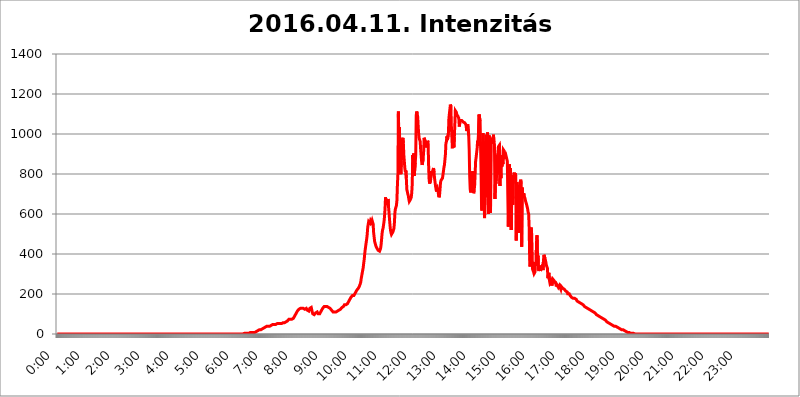
| Category | 2016.04.11. Intenzitás [W/m^2] |
|---|---|
| 0.0 | 0 |
| 0.0006944444444444445 | 0 |
| 0.001388888888888889 | 0 |
| 0.0020833333333333333 | 0 |
| 0.002777777777777778 | 0 |
| 0.003472222222222222 | 0 |
| 0.004166666666666667 | 0 |
| 0.004861111111111111 | 0 |
| 0.005555555555555556 | 0 |
| 0.0062499999999999995 | 0 |
| 0.006944444444444444 | 0 |
| 0.007638888888888889 | 0 |
| 0.008333333333333333 | 0 |
| 0.009027777777777779 | 0 |
| 0.009722222222222222 | 0 |
| 0.010416666666666666 | 0 |
| 0.011111111111111112 | 0 |
| 0.011805555555555555 | 0 |
| 0.012499999999999999 | 0 |
| 0.013194444444444444 | 0 |
| 0.013888888888888888 | 0 |
| 0.014583333333333332 | 0 |
| 0.015277777777777777 | 0 |
| 0.015972222222222224 | 0 |
| 0.016666666666666666 | 0 |
| 0.017361111111111112 | 0 |
| 0.018055555555555557 | 0 |
| 0.01875 | 0 |
| 0.019444444444444445 | 0 |
| 0.02013888888888889 | 0 |
| 0.020833333333333332 | 0 |
| 0.02152777777777778 | 0 |
| 0.022222222222222223 | 0 |
| 0.02291666666666667 | 0 |
| 0.02361111111111111 | 0 |
| 0.024305555555555556 | 0 |
| 0.024999999999999998 | 0 |
| 0.025694444444444447 | 0 |
| 0.02638888888888889 | 0 |
| 0.027083333333333334 | 0 |
| 0.027777777777777776 | 0 |
| 0.02847222222222222 | 0 |
| 0.029166666666666664 | 0 |
| 0.029861111111111113 | 0 |
| 0.030555555555555555 | 0 |
| 0.03125 | 0 |
| 0.03194444444444445 | 0 |
| 0.03263888888888889 | 0 |
| 0.03333333333333333 | 0 |
| 0.034027777777777775 | 0 |
| 0.034722222222222224 | 0 |
| 0.035416666666666666 | 0 |
| 0.036111111111111115 | 0 |
| 0.03680555555555556 | 0 |
| 0.0375 | 0 |
| 0.03819444444444444 | 0 |
| 0.03888888888888889 | 0 |
| 0.03958333333333333 | 0 |
| 0.04027777777777778 | 0 |
| 0.04097222222222222 | 0 |
| 0.041666666666666664 | 0 |
| 0.042361111111111106 | 0 |
| 0.04305555555555556 | 0 |
| 0.043750000000000004 | 0 |
| 0.044444444444444446 | 0 |
| 0.04513888888888889 | 0 |
| 0.04583333333333334 | 0 |
| 0.04652777777777778 | 0 |
| 0.04722222222222222 | 0 |
| 0.04791666666666666 | 0 |
| 0.04861111111111111 | 0 |
| 0.049305555555555554 | 0 |
| 0.049999999999999996 | 0 |
| 0.05069444444444445 | 0 |
| 0.051388888888888894 | 0 |
| 0.052083333333333336 | 0 |
| 0.05277777777777778 | 0 |
| 0.05347222222222222 | 0 |
| 0.05416666666666667 | 0 |
| 0.05486111111111111 | 0 |
| 0.05555555555555555 | 0 |
| 0.05625 | 0 |
| 0.05694444444444444 | 0 |
| 0.057638888888888885 | 0 |
| 0.05833333333333333 | 0 |
| 0.05902777777777778 | 0 |
| 0.059722222222222225 | 0 |
| 0.06041666666666667 | 0 |
| 0.061111111111111116 | 0 |
| 0.06180555555555556 | 0 |
| 0.0625 | 0 |
| 0.06319444444444444 | 0 |
| 0.06388888888888888 | 0 |
| 0.06458333333333334 | 0 |
| 0.06527777777777778 | 0 |
| 0.06597222222222222 | 0 |
| 0.06666666666666667 | 0 |
| 0.06736111111111111 | 0 |
| 0.06805555555555555 | 0 |
| 0.06874999999999999 | 0 |
| 0.06944444444444443 | 0 |
| 0.07013888888888889 | 0 |
| 0.07083333333333333 | 0 |
| 0.07152777777777779 | 0 |
| 0.07222222222222223 | 0 |
| 0.07291666666666667 | 0 |
| 0.07361111111111111 | 0 |
| 0.07430555555555556 | 0 |
| 0.075 | 0 |
| 0.07569444444444444 | 0 |
| 0.0763888888888889 | 0 |
| 0.07708333333333334 | 0 |
| 0.07777777777777778 | 0 |
| 0.07847222222222222 | 0 |
| 0.07916666666666666 | 0 |
| 0.0798611111111111 | 0 |
| 0.08055555555555556 | 0 |
| 0.08125 | 0 |
| 0.08194444444444444 | 0 |
| 0.08263888888888889 | 0 |
| 0.08333333333333333 | 0 |
| 0.08402777777777777 | 0 |
| 0.08472222222222221 | 0 |
| 0.08541666666666665 | 0 |
| 0.08611111111111112 | 0 |
| 0.08680555555555557 | 0 |
| 0.08750000000000001 | 0 |
| 0.08819444444444445 | 0 |
| 0.08888888888888889 | 0 |
| 0.08958333333333333 | 0 |
| 0.09027777777777778 | 0 |
| 0.09097222222222222 | 0 |
| 0.09166666666666667 | 0 |
| 0.09236111111111112 | 0 |
| 0.09305555555555556 | 0 |
| 0.09375 | 0 |
| 0.09444444444444444 | 0 |
| 0.09513888888888888 | 0 |
| 0.09583333333333333 | 0 |
| 0.09652777777777777 | 0 |
| 0.09722222222222222 | 0 |
| 0.09791666666666667 | 0 |
| 0.09861111111111111 | 0 |
| 0.09930555555555555 | 0 |
| 0.09999999999999999 | 0 |
| 0.10069444444444443 | 0 |
| 0.1013888888888889 | 0 |
| 0.10208333333333335 | 0 |
| 0.10277777777777779 | 0 |
| 0.10347222222222223 | 0 |
| 0.10416666666666667 | 0 |
| 0.10486111111111111 | 0 |
| 0.10555555555555556 | 0 |
| 0.10625 | 0 |
| 0.10694444444444444 | 0 |
| 0.1076388888888889 | 0 |
| 0.10833333333333334 | 0 |
| 0.10902777777777778 | 0 |
| 0.10972222222222222 | 0 |
| 0.1111111111111111 | 0 |
| 0.11180555555555556 | 0 |
| 0.11180555555555556 | 0 |
| 0.1125 | 0 |
| 0.11319444444444444 | 0 |
| 0.11388888888888889 | 0 |
| 0.11458333333333333 | 0 |
| 0.11527777777777777 | 0 |
| 0.11597222222222221 | 0 |
| 0.11666666666666665 | 0 |
| 0.1173611111111111 | 0 |
| 0.11805555555555557 | 0 |
| 0.11944444444444445 | 0 |
| 0.12013888888888889 | 0 |
| 0.12083333333333333 | 0 |
| 0.12152777777777778 | 0 |
| 0.12222222222222223 | 0 |
| 0.12291666666666667 | 0 |
| 0.12291666666666667 | 0 |
| 0.12361111111111112 | 0 |
| 0.12430555555555556 | 0 |
| 0.125 | 0 |
| 0.12569444444444444 | 0 |
| 0.12638888888888888 | 0 |
| 0.12708333333333333 | 0 |
| 0.16875 | 0 |
| 0.12847222222222224 | 0 |
| 0.12916666666666668 | 0 |
| 0.12986111111111112 | 0 |
| 0.13055555555555556 | 0 |
| 0.13125 | 0 |
| 0.13194444444444445 | 0 |
| 0.1326388888888889 | 0 |
| 0.13333333333333333 | 0 |
| 0.13402777777777777 | 0 |
| 0.13402777777777777 | 0 |
| 0.13472222222222222 | 0 |
| 0.13541666666666666 | 0 |
| 0.1361111111111111 | 0 |
| 0.13749999999999998 | 0 |
| 0.13819444444444443 | 0 |
| 0.1388888888888889 | 0 |
| 0.13958333333333334 | 0 |
| 0.14027777777777778 | 0 |
| 0.14097222222222222 | 0 |
| 0.14166666666666666 | 0 |
| 0.1423611111111111 | 0 |
| 0.14305555555555557 | 0 |
| 0.14375000000000002 | 0 |
| 0.14444444444444446 | 0 |
| 0.1451388888888889 | 0 |
| 0.1451388888888889 | 0 |
| 0.14652777777777778 | 0 |
| 0.14722222222222223 | 0 |
| 0.14791666666666667 | 0 |
| 0.1486111111111111 | 0 |
| 0.14930555555555555 | 0 |
| 0.15 | 0 |
| 0.15069444444444444 | 0 |
| 0.15138888888888888 | 0 |
| 0.15208333333333332 | 0 |
| 0.15277777777777776 | 0 |
| 0.15347222222222223 | 0 |
| 0.15416666666666667 | 0 |
| 0.15486111111111112 | 0 |
| 0.15555555555555556 | 0 |
| 0.15625 | 0 |
| 0.15694444444444444 | 0 |
| 0.15763888888888888 | 0 |
| 0.15833333333333333 | 0 |
| 0.15902777777777777 | 0 |
| 0.15972222222222224 | 0 |
| 0.16041666666666668 | 0 |
| 0.16111111111111112 | 0 |
| 0.16180555555555556 | 0 |
| 0.1625 | 0 |
| 0.16319444444444445 | 0 |
| 0.1638888888888889 | 0 |
| 0.16458333333333333 | 0 |
| 0.16527777777777777 | 0 |
| 0.16597222222222222 | 0 |
| 0.16666666666666666 | 0 |
| 0.1673611111111111 | 0 |
| 0.16805555555555554 | 0 |
| 0.16874999999999998 | 0 |
| 0.16944444444444443 | 0 |
| 0.17013888888888887 | 0 |
| 0.1708333333333333 | 0 |
| 0.17152777777777775 | 0 |
| 0.17222222222222225 | 0 |
| 0.1729166666666667 | 0 |
| 0.17361111111111113 | 0 |
| 0.17430555555555557 | 0 |
| 0.17500000000000002 | 0 |
| 0.17569444444444446 | 0 |
| 0.1763888888888889 | 0 |
| 0.17708333333333334 | 0 |
| 0.17777777777777778 | 0 |
| 0.17847222222222223 | 0 |
| 0.17916666666666667 | 0 |
| 0.1798611111111111 | 0 |
| 0.18055555555555555 | 0 |
| 0.18125 | 0 |
| 0.18194444444444444 | 0 |
| 0.1826388888888889 | 0 |
| 0.18333333333333335 | 0 |
| 0.1840277777777778 | 0 |
| 0.18472222222222223 | 0 |
| 0.18541666666666667 | 0 |
| 0.18611111111111112 | 0 |
| 0.18680555555555556 | 0 |
| 0.1875 | 0 |
| 0.18819444444444444 | 0 |
| 0.18888888888888888 | 0 |
| 0.18958333333333333 | 0 |
| 0.19027777777777777 | 0 |
| 0.1909722222222222 | 0 |
| 0.19166666666666665 | 0 |
| 0.19236111111111112 | 0 |
| 0.19305555555555554 | 0 |
| 0.19375 | 0 |
| 0.19444444444444445 | 0 |
| 0.1951388888888889 | 0 |
| 0.19583333333333333 | 0 |
| 0.19652777777777777 | 0 |
| 0.19722222222222222 | 0 |
| 0.19791666666666666 | 0 |
| 0.1986111111111111 | 0 |
| 0.19930555555555554 | 0 |
| 0.19999999999999998 | 0 |
| 0.20069444444444443 | 0 |
| 0.20138888888888887 | 0 |
| 0.2020833333333333 | 0 |
| 0.2027777777777778 | 0 |
| 0.2034722222222222 | 0 |
| 0.2041666666666667 | 0 |
| 0.20486111111111113 | 0 |
| 0.20555555555555557 | 0 |
| 0.20625000000000002 | 0 |
| 0.20694444444444446 | 0 |
| 0.2076388888888889 | 0 |
| 0.20833333333333334 | 0 |
| 0.20902777777777778 | 0 |
| 0.20972222222222223 | 0 |
| 0.21041666666666667 | 0 |
| 0.2111111111111111 | 0 |
| 0.21180555555555555 | 0 |
| 0.2125 | 0 |
| 0.21319444444444444 | 0 |
| 0.2138888888888889 | 0 |
| 0.21458333333333335 | 0 |
| 0.2152777777777778 | 0 |
| 0.21597222222222223 | 0 |
| 0.21666666666666667 | 0 |
| 0.21736111111111112 | 0 |
| 0.21805555555555556 | 0 |
| 0.21875 | 0 |
| 0.21944444444444444 | 0 |
| 0.22013888888888888 | 0 |
| 0.22083333333333333 | 0 |
| 0.22152777777777777 | 0 |
| 0.2222222222222222 | 0 |
| 0.22291666666666665 | 0 |
| 0.2236111111111111 | 0 |
| 0.22430555555555556 | 0 |
| 0.225 | 0 |
| 0.22569444444444445 | 0 |
| 0.2263888888888889 | 0 |
| 0.22708333333333333 | 0 |
| 0.22777777777777777 | 0 |
| 0.22847222222222222 | 0 |
| 0.22916666666666666 | 0 |
| 0.2298611111111111 | 0 |
| 0.23055555555555554 | 0 |
| 0.23124999999999998 | 0 |
| 0.23194444444444443 | 0 |
| 0.23263888888888887 | 0 |
| 0.2333333333333333 | 0 |
| 0.2340277777777778 | 0 |
| 0.2347222222222222 | 0 |
| 0.2354166666666667 | 0 |
| 0.23611111111111113 | 0 |
| 0.23680555555555557 | 0 |
| 0.23750000000000002 | 0 |
| 0.23819444444444446 | 0 |
| 0.2388888888888889 | 0 |
| 0.23958333333333334 | 0 |
| 0.24027777777777778 | 0 |
| 0.24097222222222223 | 0 |
| 0.24166666666666667 | 0 |
| 0.2423611111111111 | 0 |
| 0.24305555555555555 | 0 |
| 0.24375 | 0 |
| 0.24444444444444446 | 0 |
| 0.24513888888888888 | 0 |
| 0.24583333333333335 | 0 |
| 0.2465277777777778 | 0 |
| 0.24722222222222223 | 0 |
| 0.24791666666666667 | 0 |
| 0.24861111111111112 | 0 |
| 0.24930555555555556 | 0 |
| 0.25 | 0 |
| 0.25069444444444444 | 0 |
| 0.2513888888888889 | 0 |
| 0.2520833333333333 | 0 |
| 0.25277777777777777 | 0 |
| 0.2534722222222222 | 0 |
| 0.25416666666666665 | 0 |
| 0.2548611111111111 | 0 |
| 0.2555555555555556 | 0 |
| 0.25625000000000003 | 0 |
| 0.2569444444444445 | 0 |
| 0.2576388888888889 | 0 |
| 0.25833333333333336 | 0 |
| 0.2590277777777778 | 0 |
| 0.25972222222222224 | 0 |
| 0.2604166666666667 | 0 |
| 0.2611111111111111 | 3.525 |
| 0.26180555555555557 | 3.525 |
| 0.2625 | 3.525 |
| 0.26319444444444445 | 3.525 |
| 0.2638888888888889 | 3.525 |
| 0.26458333333333334 | 3.525 |
| 0.2652777777777778 | 3.525 |
| 0.2659722222222222 | 3.525 |
| 0.26666666666666666 | 3.525 |
| 0.2673611111111111 | 3.525 |
| 0.26805555555555555 | 3.525 |
| 0.26875 | 3.525 |
| 0.26944444444444443 | 7.887 |
| 0.2701388888888889 | 7.887 |
| 0.2708333333333333 | 7.887 |
| 0.27152777777777776 | 7.887 |
| 0.2722222222222222 | 7.887 |
| 0.27291666666666664 | 7.887 |
| 0.2736111111111111 | 7.887 |
| 0.2743055555555555 | 7.887 |
| 0.27499999999999997 | 7.887 |
| 0.27569444444444446 | 7.887 |
| 0.27638888888888885 | 7.887 |
| 0.27708333333333335 | 7.887 |
| 0.2777777777777778 | 7.887 |
| 0.27847222222222223 | 12.257 |
| 0.2791666666666667 | 12.257 |
| 0.2798611111111111 | 12.257 |
| 0.28055555555555556 | 12.257 |
| 0.28125 | 16.636 |
| 0.28194444444444444 | 16.636 |
| 0.2826388888888889 | 16.636 |
| 0.2833333333333333 | 21.024 |
| 0.28402777777777777 | 21.024 |
| 0.2847222222222222 | 21.024 |
| 0.28541666666666665 | 21.024 |
| 0.28611111111111115 | 21.024 |
| 0.28680555555555554 | 21.024 |
| 0.28750000000000003 | 25.419 |
| 0.2881944444444445 | 25.419 |
| 0.2888888888888889 | 25.419 |
| 0.28958333333333336 | 29.823 |
| 0.2902777777777778 | 29.823 |
| 0.29097222222222224 | 29.823 |
| 0.2916666666666667 | 34.234 |
| 0.2923611111111111 | 34.234 |
| 0.29305555555555557 | 34.234 |
| 0.29375 | 38.653 |
| 0.29444444444444445 | 38.653 |
| 0.2951388888888889 | 38.653 |
| 0.29583333333333334 | 38.653 |
| 0.2965277777777778 | 38.653 |
| 0.2972222222222222 | 38.653 |
| 0.29791666666666666 | 38.653 |
| 0.2986111111111111 | 38.653 |
| 0.29930555555555555 | 38.653 |
| 0.3 | 43.079 |
| 0.30069444444444443 | 43.079 |
| 0.3013888888888889 | 43.079 |
| 0.3020833333333333 | 47.511 |
| 0.30277777777777776 | 47.511 |
| 0.3034722222222222 | 47.511 |
| 0.30416666666666664 | 47.511 |
| 0.3048611111111111 | 47.511 |
| 0.3055555555555555 | 47.511 |
| 0.30624999999999997 | 47.511 |
| 0.3069444444444444 | 47.511 |
| 0.3076388888888889 | 47.511 |
| 0.30833333333333335 | 51.951 |
| 0.3090277777777778 | 51.951 |
| 0.30972222222222223 | 51.951 |
| 0.3104166666666667 | 51.951 |
| 0.3111111111111111 | 51.951 |
| 0.31180555555555556 | 51.951 |
| 0.3125 | 51.951 |
| 0.31319444444444444 | 51.951 |
| 0.3138888888888889 | 51.951 |
| 0.3145833333333333 | 51.951 |
| 0.31527777777777777 | 51.951 |
| 0.3159722222222222 | 56.398 |
| 0.31666666666666665 | 56.398 |
| 0.31736111111111115 | 56.398 |
| 0.31805555555555554 | 56.398 |
| 0.31875000000000003 | 56.398 |
| 0.3194444444444445 | 56.398 |
| 0.3201388888888889 | 60.85 |
| 0.32083333333333336 | 60.85 |
| 0.3215277777777778 | 60.85 |
| 0.32222222222222224 | 60.85 |
| 0.3229166666666667 | 65.31 |
| 0.3236111111111111 | 65.31 |
| 0.32430555555555557 | 69.775 |
| 0.325 | 74.246 |
| 0.32569444444444445 | 74.246 |
| 0.3263888888888889 | 74.246 |
| 0.32708333333333334 | 74.246 |
| 0.3277777777777778 | 74.246 |
| 0.3284722222222222 | 74.246 |
| 0.32916666666666666 | 74.246 |
| 0.3298611111111111 | 74.246 |
| 0.33055555555555555 | 78.722 |
| 0.33125 | 78.722 |
| 0.33194444444444443 | 83.205 |
| 0.3326388888888889 | 87.692 |
| 0.3333333333333333 | 92.184 |
| 0.3340277777777778 | 96.682 |
| 0.3347222222222222 | 101.184 |
| 0.3354166666666667 | 105.69 |
| 0.3361111111111111 | 110.201 |
| 0.3368055555555556 | 114.716 |
| 0.33749999999999997 | 119.235 |
| 0.33819444444444446 | 119.235 |
| 0.33888888888888885 | 123.758 |
| 0.33958333333333335 | 128.284 |
| 0.34027777777777773 | 128.284 |
| 0.34097222222222223 | 128.284 |
| 0.3416666666666666 | 128.284 |
| 0.3423611111111111 | 132.814 |
| 0.3430555555555555 | 128.284 |
| 0.34375 | 128.284 |
| 0.3444444444444445 | 128.284 |
| 0.3451388888888889 | 128.284 |
| 0.3458333333333334 | 123.758 |
| 0.34652777777777777 | 123.758 |
| 0.34722222222222227 | 123.758 |
| 0.34791666666666665 | 128.284 |
| 0.34861111111111115 | 128.284 |
| 0.34930555555555554 | 128.284 |
| 0.35000000000000003 | 128.284 |
| 0.3506944444444444 | 119.235 |
| 0.3513888888888889 | 119.235 |
| 0.3520833333333333 | 114.716 |
| 0.3527777777777778 | 114.716 |
| 0.3534722222222222 | 119.235 |
| 0.3541666666666667 | 128.284 |
| 0.3548611111111111 | 132.814 |
| 0.35555555555555557 | 132.814 |
| 0.35625 | 132.814 |
| 0.35694444444444445 | 128.284 |
| 0.3576388888888889 | 110.201 |
| 0.35833333333333334 | 101.184 |
| 0.3590277777777778 | 96.682 |
| 0.3597222222222222 | 96.682 |
| 0.36041666666666666 | 96.682 |
| 0.3611111111111111 | 96.682 |
| 0.36180555555555555 | 101.184 |
| 0.3625 | 105.69 |
| 0.36319444444444443 | 110.201 |
| 0.3638888888888889 | 110.201 |
| 0.3645833333333333 | 110.201 |
| 0.3652777777777778 | 105.69 |
| 0.3659722222222222 | 101.184 |
| 0.3666666666666667 | 101.184 |
| 0.3673611111111111 | 101.184 |
| 0.3680555555555556 | 101.184 |
| 0.36874999999999997 | 105.69 |
| 0.36944444444444446 | 110.201 |
| 0.37013888888888885 | 114.716 |
| 0.37083333333333335 | 119.235 |
| 0.37152777777777773 | 123.758 |
| 0.37222222222222223 | 128.284 |
| 0.3729166666666666 | 128.284 |
| 0.3736111111111111 | 132.814 |
| 0.3743055555555555 | 137.347 |
| 0.375 | 137.347 |
| 0.3756944444444445 | 137.347 |
| 0.3763888888888889 | 137.347 |
| 0.3770833333333334 | 137.347 |
| 0.37777777777777777 | 137.347 |
| 0.37847222222222227 | 137.347 |
| 0.37916666666666665 | 137.347 |
| 0.37986111111111115 | 132.814 |
| 0.38055555555555554 | 132.814 |
| 0.38125000000000003 | 132.814 |
| 0.3819444444444444 | 132.814 |
| 0.3826388888888889 | 128.284 |
| 0.3833333333333333 | 128.284 |
| 0.3840277777777778 | 123.758 |
| 0.3847222222222222 | 119.235 |
| 0.3854166666666667 | 114.716 |
| 0.3861111111111111 | 114.716 |
| 0.38680555555555557 | 110.201 |
| 0.3875 | 110.201 |
| 0.38819444444444445 | 110.201 |
| 0.3888888888888889 | 110.201 |
| 0.38958333333333334 | 110.201 |
| 0.3902777777777778 | 110.201 |
| 0.3909722222222222 | 110.201 |
| 0.39166666666666666 | 110.201 |
| 0.3923611111111111 | 114.716 |
| 0.39305555555555555 | 114.716 |
| 0.39375 | 119.235 |
| 0.39444444444444443 | 119.235 |
| 0.3951388888888889 | 119.235 |
| 0.3958333333333333 | 123.758 |
| 0.3965277777777778 | 123.758 |
| 0.3972222222222222 | 123.758 |
| 0.3979166666666667 | 123.758 |
| 0.3986111111111111 | 128.284 |
| 0.3993055555555556 | 132.814 |
| 0.39999999999999997 | 132.814 |
| 0.40069444444444446 | 137.347 |
| 0.40138888888888885 | 137.347 |
| 0.40208333333333335 | 141.884 |
| 0.40277777777777773 | 146.423 |
| 0.40347222222222223 | 146.423 |
| 0.4041666666666666 | 146.423 |
| 0.4048611111111111 | 146.423 |
| 0.4055555555555555 | 146.423 |
| 0.40625 | 146.423 |
| 0.4069444444444445 | 150.964 |
| 0.4076388888888889 | 155.509 |
| 0.4083333333333334 | 160.056 |
| 0.40902777777777777 | 164.605 |
| 0.40972222222222227 | 169.156 |
| 0.41041666666666665 | 173.709 |
| 0.41111111111111115 | 173.709 |
| 0.41180555555555554 | 182.82 |
| 0.41250000000000003 | 182.82 |
| 0.4131944444444444 | 187.378 |
| 0.4138888888888889 | 191.937 |
| 0.4145833333333333 | 191.937 |
| 0.4152777777777778 | 191.937 |
| 0.4159722222222222 | 191.937 |
| 0.4166666666666667 | 196.497 |
| 0.4173611111111111 | 201.058 |
| 0.41805555555555557 | 205.62 |
| 0.41875 | 210.182 |
| 0.41944444444444445 | 214.746 |
| 0.4201388888888889 | 219.309 |
| 0.42083333333333334 | 219.309 |
| 0.4215277777777778 | 223.873 |
| 0.4222222222222222 | 228.436 |
| 0.42291666666666666 | 233 |
| 0.4236111111111111 | 237.564 |
| 0.42430555555555555 | 242.127 |
| 0.425 | 251.251 |
| 0.42569444444444443 | 260.373 |
| 0.4263888888888889 | 278.603 |
| 0.4270833333333333 | 292.259 |
| 0.4277777777777778 | 305.898 |
| 0.4284722222222222 | 319.517 |
| 0.4291666666666667 | 333.113 |
| 0.4298611111111111 | 355.712 |
| 0.4305555555555556 | 373.729 |
| 0.43124999999999997 | 400.638 |
| 0.43194444444444446 | 422.943 |
| 0.43263888888888885 | 440.702 |
| 0.43333333333333335 | 458.38 |
| 0.43402777777777773 | 475.972 |
| 0.43472222222222223 | 497.836 |
| 0.4354166666666666 | 532.513 |
| 0.4361111111111111 | 536.82 |
| 0.4368055555555555 | 562.53 |
| 0.4375 | 562.53 |
| 0.4381944444444445 | 558.261 |
| 0.4388888888888889 | 553.986 |
| 0.4395833333333334 | 566.793 |
| 0.44027777777777777 | 562.53 |
| 0.44097222222222227 | 558.261 |
| 0.44166666666666665 | 566.793 |
| 0.44236111111111115 | 571.049 |
| 0.44305555555555554 | 549.704 |
| 0.44375000000000003 | 506.542 |
| 0.4444444444444444 | 484.735 |
| 0.4451388888888889 | 462.786 |
| 0.4458333333333333 | 453.968 |
| 0.4465277777777778 | 445.129 |
| 0.4472222222222222 | 436.27 |
| 0.4479166666666667 | 431.833 |
| 0.4486111111111111 | 427.39 |
| 0.44930555555555557 | 422.943 |
| 0.45 | 418.492 |
| 0.45069444444444445 | 418.492 |
| 0.4513888888888889 | 418.492 |
| 0.45208333333333334 | 414.035 |
| 0.4527777777777778 | 418.492 |
| 0.4534722222222222 | 427.39 |
| 0.45416666666666666 | 445.129 |
| 0.4548611111111111 | 471.582 |
| 0.45555555555555555 | 502.192 |
| 0.45625 | 519.555 |
| 0.45694444444444443 | 528.2 |
| 0.4576388888888889 | 545.416 |
| 0.4583333333333333 | 562.53 |
| 0.4590277777777778 | 588.009 |
| 0.4597222222222222 | 625.784 |
| 0.4604166666666667 | 683.473 |
| 0.4611111111111111 | 667.123 |
| 0.4618055555555556 | 658.909 |
| 0.46249999999999997 | 658.909 |
| 0.46319444444444446 | 646.537 |
| 0.46388888888888885 | 675.311 |
| 0.46458333333333335 | 638.256 |
| 0.46527777777777773 | 609.062 |
| 0.46597222222222223 | 575.299 |
| 0.4666666666666666 | 545.416 |
| 0.4673611111111111 | 519.555 |
| 0.4680555555555555 | 506.542 |
| 0.46875 | 497.836 |
| 0.4694444444444445 | 497.836 |
| 0.4701388888888889 | 502.192 |
| 0.4708333333333334 | 510.885 |
| 0.47152777777777777 | 519.555 |
| 0.47222222222222227 | 528.2 |
| 0.47291666666666665 | 558.261 |
| 0.47361111111111115 | 609.062 |
| 0.47430555555555554 | 625.784 |
| 0.47500000000000003 | 621.613 |
| 0.4756944444444444 | 642.4 |
| 0.4763888888888889 | 667.123 |
| 0.4770833333333333 | 743.859 |
| 0.4777777777777778 | 798.974 |
| 0.4784722222222222 | 1112.618 |
| 0.4791666666666667 | 921.298 |
| 0.4798611111111111 | 1033.537 |
| 0.48055555555555557 | 906.223 |
| 0.48125 | 814.519 |
| 0.48194444444444445 | 798.974 |
| 0.4826388888888889 | 868.305 |
| 0.48333333333333334 | 962.555 |
| 0.4840277777777778 | 966.295 |
| 0.4847222222222222 | 981.244 |
| 0.48541666666666666 | 955.071 |
| 0.4861111111111111 | 894.885 |
| 0.48680555555555555 | 894.885 |
| 0.4875 | 829.981 |
| 0.48819444444444443 | 810.641 |
| 0.4888888888888889 | 818.392 |
| 0.4895833333333333 | 779.42 |
| 0.4902777777777778 | 723.889 |
| 0.4909722222222222 | 711.832 |
| 0.4916666666666667 | 699.717 |
| 0.4923611111111111 | 691.608 |
| 0.4930555555555556 | 675.311 |
| 0.49374999999999997 | 663.019 |
| 0.49444444444444446 | 667.123 |
| 0.49513888888888885 | 671.22 |
| 0.49583333333333335 | 675.311 |
| 0.49652777777777773 | 683.473 |
| 0.49722222222222223 | 707.8 |
| 0.4979166666666666 | 751.803 |
| 0.4986111111111111 | 894.885 |
| 0.4993055555555555 | 818.392 |
| 0.5 | 902.447 |
| 0.5006944444444444 | 791.169 |
| 0.5013888888888889 | 787.258 |
| 0.5020833333333333 | 856.855 |
| 0.5027777777777778 | 894.885 |
| 0.5034722222222222 | 1093.653 |
| 0.5041666666666667 | 1112.618 |
| 0.5048611111111111 | 1101.226 |
| 0.5055555555555555 | 1086.097 |
| 0.50625 | 1037.277 |
| 0.5069444444444444 | 999.916 |
| 0.5076388888888889 | 977.508 |
| 0.5083333333333333 | 977.508 |
| 0.5090277777777777 | 962.555 |
| 0.5097222222222222 | 921.298 |
| 0.5104166666666666 | 891.099 |
| 0.5111111111111112 | 860.676 |
| 0.5118055555555555 | 845.365 |
| 0.5125000000000001 | 845.365 |
| 0.5131944444444444 | 875.918 |
| 0.513888888888889 | 913.766 |
| 0.5145833333333333 | 981.244 |
| 0.5152777777777778 | 977.508 |
| 0.5159722222222222 | 981.244 |
| 0.5166666666666667 | 955.071 |
| 0.517361111111111 | 947.58 |
| 0.5180555555555556 | 932.576 |
| 0.5187499999999999 | 951.327 |
| 0.5194444444444445 | 966.295 |
| 0.5201388888888888 | 958.814 |
| 0.5208333333333334 | 845.365 |
| 0.5215277777777778 | 775.492 |
| 0.5222222222222223 | 751.803 |
| 0.5229166666666667 | 755.766 |
| 0.5236111111111111 | 767.62 |
| 0.5243055555555556 | 791.169 |
| 0.525 | 814.519 |
| 0.5256944444444445 | 806.757 |
| 0.5263888888888889 | 814.519 |
| 0.5270833333333333 | 822.26 |
| 0.5277777777777778 | 829.981 |
| 0.5284722222222222 | 806.757 |
| 0.5291666666666667 | 779.42 |
| 0.5298611111111111 | 759.723 |
| 0.5305555555555556 | 739.877 |
| 0.53125 | 723.889 |
| 0.5319444444444444 | 711.832 |
| 0.5326388888888889 | 715.858 |
| 0.5333333333333333 | 727.896 |
| 0.5340277777777778 | 719.877 |
| 0.5347222222222222 | 695.666 |
| 0.5354166666666667 | 683.473 |
| 0.5361111111111111 | 691.608 |
| 0.5368055555555555 | 719.877 |
| 0.5375 | 755.766 |
| 0.5381944444444444 | 767.62 |
| 0.5388888888888889 | 771.559 |
| 0.5395833333333333 | 771.559 |
| 0.5402777777777777 | 779.42 |
| 0.5409722222222222 | 795.074 |
| 0.5416666666666666 | 814.519 |
| 0.5423611111111112 | 833.834 |
| 0.5430555555555555 | 845.365 |
| 0.5437500000000001 | 872.114 |
| 0.5444444444444444 | 898.668 |
| 0.545138888888889 | 955.071 |
| 0.5458333333333333 | 962.555 |
| 0.5465277777777778 | 988.714 |
| 0.5472222222222222 | 970.034 |
| 0.5479166666666667 | 966.295 |
| 0.548611111111111 | 1003.65 |
| 0.5493055555555556 | 1078.555 |
| 0.5499999999999999 | 1101.226 |
| 0.5506944444444445 | 1124.056 |
| 0.5513888888888888 | 1147.086 |
| 0.5520833333333334 | 1139.384 |
| 0.5527777777777778 | 1037.277 |
| 0.5534722222222223 | 984.98 |
| 0.5541666666666667 | 928.819 |
| 0.5548611111111111 | 970.034 |
| 0.5555555555555556 | 962.555 |
| 0.55625 | 932.576 |
| 0.5569444444444445 | 984.98 |
| 0.5576388888888889 | 1048.508 |
| 0.5583333333333333 | 1116.426 |
| 0.5590277777777778 | 1120.238 |
| 0.5597222222222222 | 1108.816 |
| 0.5604166666666667 | 1097.437 |
| 0.5611111111111111 | 1093.653 |
| 0.5618055555555556 | 1089.873 |
| 0.5625 | 1086.097 |
| 0.5631944444444444 | 1078.555 |
| 0.5638888888888889 | 1037.277 |
| 0.5645833333333333 | 1056.004 |
| 0.5652777777777778 | 1067.267 |
| 0.5659722222222222 | 1067.267 |
| 0.5666666666666667 | 1067.267 |
| 0.5673611111111111 | 1067.267 |
| 0.5680555555555555 | 1067.267 |
| 0.56875 | 1063.51 |
| 0.5694444444444444 | 1059.756 |
| 0.5701388888888889 | 1059.756 |
| 0.5708333333333333 | 1056.004 |
| 0.5715277777777777 | 1056.004 |
| 0.5722222222222222 | 1052.255 |
| 0.5729166666666666 | 1048.508 |
| 0.5736111111111112 | 1037.277 |
| 0.5743055555555555 | 1014.852 |
| 0.5750000000000001 | 1026.06 |
| 0.5756944444444444 | 1048.508 |
| 0.576388888888889 | 1044.762 |
| 0.5770833333333333 | 992.448 |
| 0.5777777777777778 | 921.298 |
| 0.5784722222222222 | 787.258 |
| 0.5791666666666667 | 723.889 |
| 0.579861111111111 | 707.8 |
| 0.5805555555555556 | 723.889 |
| 0.5812499999999999 | 747.834 |
| 0.5819444444444445 | 759.723 |
| 0.5826388888888888 | 814.519 |
| 0.5833333333333334 | 743.859 |
| 0.5840277777777778 | 703.762 |
| 0.5847222222222223 | 719.877 |
| 0.5854166666666667 | 743.859 |
| 0.5861111111111111 | 802.868 |
| 0.5868055555555556 | 864.493 |
| 0.5875 | 883.516 |
| 0.5881944444444445 | 887.309 |
| 0.5888888888888889 | 928.819 |
| 0.5895833333333333 | 966.295 |
| 0.5902777777777778 | 940.082 |
| 0.5909722222222222 | 936.33 |
| 0.5916666666666667 | 1097.437 |
| 0.5923611111111111 | 1101.226 |
| 0.5930555555555556 | 1063.51 |
| 0.59375 | 936.33 |
| 0.5944444444444444 | 806.757 |
| 0.5951388888888889 | 625.784 |
| 0.5958333333333333 | 617.436 |
| 0.5965277777777778 | 699.717 |
| 0.5972222222222222 | 1003.65 |
| 0.5979166666666667 | 932.576 |
| 0.5986111111111111 | 683.473 |
| 0.5993055555555555 | 579.542 |
| 0.6 | 679.395 |
| 0.6006944444444444 | 962.555 |
| 0.6013888888888889 | 826.123 |
| 0.6020833333333333 | 996.182 |
| 0.6027777777777777 | 683.473 |
| 0.6034722222222222 | 1007.383 |
| 0.6041666666666666 | 810.641 |
| 0.6048611111111112 | 600.661 |
| 0.6055555555555555 | 992.448 |
| 0.6062500000000001 | 977.508 |
| 0.6069444444444444 | 658.909 |
| 0.607638888888889 | 604.864 |
| 0.6083333333333333 | 966.295 |
| 0.6090277777777778 | 970.034 |
| 0.6097222222222222 | 981.244 |
| 0.6104166666666667 | 984.98 |
| 0.611111111111111 | 951.327 |
| 0.6118055555555556 | 996.182 |
| 0.6124999999999999 | 958.814 |
| 0.6131944444444445 | 947.58 |
| 0.6138888888888888 | 675.311 |
| 0.6145833333333334 | 759.723 |
| 0.6152777777777778 | 751.803 |
| 0.6159722222222223 | 787.258 |
| 0.6166666666666667 | 810.641 |
| 0.6173611111111111 | 891.099 |
| 0.6180555555555556 | 906.223 |
| 0.61875 | 936.33 |
| 0.6194444444444445 | 940.082 |
| 0.6201388888888889 | 943.832 |
| 0.6208333333333333 | 739.877 |
| 0.6215277777777778 | 822.26 |
| 0.6222222222222222 | 779.42 |
| 0.6229166666666667 | 894.885 |
| 0.6236111111111111 | 837.682 |
| 0.6243055555555556 | 868.305 |
| 0.625 | 849.199 |
| 0.6256944444444444 | 921.298 |
| 0.6263888888888889 | 925.06 |
| 0.6270833333333333 | 913.766 |
| 0.6277777777777778 | 887.309 |
| 0.6284722222222222 | 891.099 |
| 0.6291666666666667 | 894.885 |
| 0.6298611111111111 | 891.099 |
| 0.6305555555555555 | 891.099 |
| 0.63125 | 864.493 |
| 0.6319444444444444 | 691.608 |
| 0.6326388888888889 | 536.82 |
| 0.6333333333333333 | 691.608 |
| 0.6340277777777777 | 849.199 |
| 0.6347222222222222 | 806.757 |
| 0.6354166666666666 | 829.981 |
| 0.6361111111111112 | 833.834 |
| 0.6368055555555555 | 519.555 |
| 0.6375000000000001 | 747.834 |
| 0.6381944444444444 | 783.342 |
| 0.638888888888889 | 646.537 |
| 0.6395833333333333 | 795.074 |
| 0.6402777777777778 | 775.492 |
| 0.6409722222222222 | 806.757 |
| 0.6416666666666667 | 779.42 |
| 0.642361111111111 | 802.868 |
| 0.6430555555555556 | 791.169 |
| 0.6437499999999999 | 467.187 |
| 0.6444444444444445 | 759.723 |
| 0.6451388888888888 | 562.53 |
| 0.6458333333333334 | 541.121 |
| 0.6465277777777778 | 703.762 |
| 0.6472222222222223 | 506.542 |
| 0.6479166666666667 | 715.858 |
| 0.6486111111111111 | 751.803 |
| 0.6493055555555556 | 759.723 |
| 0.65 | 771.559 |
| 0.6506944444444445 | 751.803 |
| 0.6513888888888889 | 436.27 |
| 0.6520833333333333 | 731.896 |
| 0.6527777777777778 | 691.608 |
| 0.6534722222222222 | 679.395 |
| 0.6541666666666667 | 703.762 |
| 0.6548611111111111 | 691.608 |
| 0.6555555555555556 | 687.544 |
| 0.65625 | 675.311 |
| 0.6569444444444444 | 663.019 |
| 0.6576388888888889 | 654.791 |
| 0.6583333333333333 | 646.537 |
| 0.6590277777777778 | 642.4 |
| 0.6597222222222222 | 625.784 |
| 0.6604166666666667 | 609.062 |
| 0.6611111111111111 | 600.661 |
| 0.6618055555555555 | 541.121 |
| 0.6625 | 400.638 |
| 0.6631944444444444 | 337.639 |
| 0.6638888888888889 | 471.582 |
| 0.6645833333333333 | 532.513 |
| 0.6652777777777777 | 510.885 |
| 0.6659722222222222 | 418.492 |
| 0.6666666666666666 | 324.052 |
| 0.6673611111111111 | 328.584 |
| 0.6680555555555556 | 310.44 |
| 0.6687500000000001 | 301.354 |
| 0.6694444444444444 | 301.354 |
| 0.6701388888888888 | 310.44 |
| 0.6708333333333334 | 360.221 |
| 0.6715277777777778 | 342.162 |
| 0.6722222222222222 | 458.38 |
| 0.6729166666666666 | 493.475 |
| 0.6736111111111112 | 373.729 |
| 0.6743055555555556 | 391.685 |
| 0.6749999999999999 | 324.052 |
| 0.6756944444444444 | 314.98 |
| 0.6763888888888889 | 342.162 |
| 0.6770833333333334 | 324.052 |
| 0.6777777777777777 | 314.98 |
| 0.6784722222222223 | 310.44 |
| 0.6791666666666667 | 337.639 |
| 0.6798611111111111 | 324.052 |
| 0.6805555555555555 | 346.682 |
| 0.68125 | 319.517 |
| 0.6819444444444445 | 369.23 |
| 0.6826388888888889 | 396.164 |
| 0.6833333333333332 | 391.685 |
| 0.6840277777777778 | 378.224 |
| 0.6847222222222222 | 369.23 |
| 0.6854166666666667 | 355.712 |
| 0.686111111111111 | 342.162 |
| 0.6868055555555556 | 337.639 |
| 0.6875 | 328.584 |
| 0.6881944444444444 | 278.603 |
| 0.688888888888889 | 296.808 |
| 0.6895833333333333 | 305.898 |
| 0.6902777777777778 | 269.49 |
| 0.6909722222222222 | 255.813 |
| 0.6916666666666668 | 260.373 |
| 0.6923611111111111 | 264.932 |
| 0.6930555555555555 | 251.251 |
| 0.69375 | 242.127 |
| 0.6944444444444445 | 237.564 |
| 0.6951388888888889 | 274.047 |
| 0.6958333333333333 | 278.603 |
| 0.6965277777777777 | 269.49 |
| 0.6972222222222223 | 264.932 |
| 0.6979166666666666 | 264.932 |
| 0.6986111111111111 | 260.373 |
| 0.6993055555555556 | 251.251 |
| 0.7000000000000001 | 237.564 |
| 0.7006944444444444 | 246.689 |
| 0.7013888888888888 | 246.689 |
| 0.7020833333333334 | 242.127 |
| 0.7027777777777778 | 233 |
| 0.7034722222222222 | 237.564 |
| 0.7041666666666666 | 242.127 |
| 0.7048611111111112 | 246.689 |
| 0.7055555555555556 | 237.564 |
| 0.7062499999999999 | 223.873 |
| 0.7069444444444444 | 237.564 |
| 0.7076388888888889 | 237.564 |
| 0.7083333333333334 | 233 |
| 0.7090277777777777 | 228.436 |
| 0.7097222222222223 | 228.436 |
| 0.7104166666666667 | 228.436 |
| 0.7111111111111111 | 223.873 |
| 0.7118055555555555 | 219.309 |
| 0.7125 | 219.309 |
| 0.7131944444444445 | 214.746 |
| 0.7138888888888889 | 210.182 |
| 0.7145833333333332 | 210.182 |
| 0.7152777777777778 | 210.182 |
| 0.7159722222222222 | 201.058 |
| 0.7166666666666667 | 196.497 |
| 0.717361111111111 | 196.497 |
| 0.7180555555555556 | 201.058 |
| 0.71875 | 196.497 |
| 0.7194444444444444 | 191.937 |
| 0.720138888888889 | 191.937 |
| 0.7208333333333333 | 187.378 |
| 0.7215277777777778 | 182.82 |
| 0.7222222222222222 | 182.82 |
| 0.7229166666666668 | 182.82 |
| 0.7236111111111111 | 178.264 |
| 0.7243055555555555 | 178.264 |
| 0.725 | 178.264 |
| 0.7256944444444445 | 178.264 |
| 0.7263888888888889 | 173.709 |
| 0.7270833333333333 | 173.709 |
| 0.7277777777777777 | 173.709 |
| 0.7284722222222223 | 169.156 |
| 0.7291666666666666 | 164.605 |
| 0.7298611111111111 | 164.605 |
| 0.7305555555555556 | 164.605 |
| 0.7312500000000001 | 160.056 |
| 0.7319444444444444 | 160.056 |
| 0.7326388888888888 | 155.509 |
| 0.7333333333333334 | 155.509 |
| 0.7340277777777778 | 155.509 |
| 0.7347222222222222 | 150.964 |
| 0.7354166666666666 | 150.964 |
| 0.7361111111111112 | 146.423 |
| 0.7368055555555556 | 146.423 |
| 0.7374999999999999 | 146.423 |
| 0.7381944444444444 | 141.884 |
| 0.7388888888888889 | 141.884 |
| 0.7395833333333334 | 137.347 |
| 0.7402777777777777 | 137.347 |
| 0.7409722222222223 | 132.814 |
| 0.7416666666666667 | 132.814 |
| 0.7423611111111111 | 132.814 |
| 0.7430555555555555 | 128.284 |
| 0.74375 | 128.284 |
| 0.7444444444444445 | 128.284 |
| 0.7451388888888889 | 123.758 |
| 0.7458333333333332 | 123.758 |
| 0.7465277777777778 | 123.758 |
| 0.7472222222222222 | 119.235 |
| 0.7479166666666667 | 119.235 |
| 0.748611111111111 | 114.716 |
| 0.7493055555555556 | 114.716 |
| 0.75 | 114.716 |
| 0.7506944444444444 | 110.201 |
| 0.751388888888889 | 110.201 |
| 0.7520833333333333 | 110.201 |
| 0.7527777777777778 | 105.69 |
| 0.7534722222222222 | 105.69 |
| 0.7541666666666668 | 105.69 |
| 0.7548611111111111 | 101.184 |
| 0.7555555555555555 | 101.184 |
| 0.75625 | 96.682 |
| 0.7569444444444445 | 96.682 |
| 0.7576388888888889 | 96.682 |
| 0.7583333333333333 | 92.184 |
| 0.7590277777777777 | 92.184 |
| 0.7597222222222223 | 92.184 |
| 0.7604166666666666 | 87.692 |
| 0.7611111111111111 | 87.692 |
| 0.7618055555555556 | 83.205 |
| 0.7625000000000001 | 83.205 |
| 0.7631944444444444 | 83.205 |
| 0.7638888888888888 | 83.205 |
| 0.7645833333333334 | 78.722 |
| 0.7652777777777778 | 74.246 |
| 0.7659722222222222 | 74.246 |
| 0.7666666666666666 | 74.246 |
| 0.7673611111111112 | 69.775 |
| 0.7680555555555556 | 69.775 |
| 0.7687499999999999 | 69.775 |
| 0.7694444444444444 | 65.31 |
| 0.7701388888888889 | 65.31 |
| 0.7708333333333334 | 60.85 |
| 0.7715277777777777 | 60.85 |
| 0.7722222222222223 | 60.85 |
| 0.7729166666666667 | 56.398 |
| 0.7736111111111111 | 56.398 |
| 0.7743055555555555 | 56.398 |
| 0.775 | 51.951 |
| 0.7756944444444445 | 51.951 |
| 0.7763888888888889 | 51.951 |
| 0.7770833333333332 | 47.511 |
| 0.7777777777777778 | 47.511 |
| 0.7784722222222222 | 47.511 |
| 0.7791666666666667 | 43.079 |
| 0.779861111111111 | 43.079 |
| 0.7805555555555556 | 43.079 |
| 0.78125 | 38.653 |
| 0.7819444444444444 | 38.653 |
| 0.782638888888889 | 38.653 |
| 0.7833333333333333 | 38.653 |
| 0.7840277777777778 | 34.234 |
| 0.7847222222222222 | 34.234 |
| 0.7854166666666668 | 34.234 |
| 0.7861111111111111 | 29.823 |
| 0.7868055555555555 | 29.823 |
| 0.7875 | 29.823 |
| 0.7881944444444445 | 29.823 |
| 0.7888888888888889 | 25.419 |
| 0.7895833333333333 | 25.419 |
| 0.7902777777777777 | 25.419 |
| 0.7909722222222223 | 21.024 |
| 0.7916666666666666 | 21.024 |
| 0.7923611111111111 | 21.024 |
| 0.7930555555555556 | 21.024 |
| 0.7937500000000001 | 21.024 |
| 0.7944444444444444 | 16.636 |
| 0.7951388888888888 | 16.636 |
| 0.7958333333333334 | 16.636 |
| 0.7965277777777778 | 12.257 |
| 0.7972222222222222 | 12.257 |
| 0.7979166666666666 | 12.257 |
| 0.7986111111111112 | 12.257 |
| 0.7993055555555556 | 12.257 |
| 0.7999999999999999 | 7.887 |
| 0.8006944444444444 | 7.887 |
| 0.8013888888888889 | 7.887 |
| 0.8020833333333334 | 7.887 |
| 0.8027777777777777 | 3.525 |
| 0.8034722222222223 | 3.525 |
| 0.8041666666666667 | 3.525 |
| 0.8048611111111111 | 3.525 |
| 0.8055555555555555 | 3.525 |
| 0.80625 | 3.525 |
| 0.8069444444444445 | 3.525 |
| 0.8076388888888889 | 3.525 |
| 0.8083333333333332 | 3.525 |
| 0.8090277777777778 | 0 |
| 0.8097222222222222 | 0 |
| 0.8104166666666667 | 0 |
| 0.811111111111111 | 0 |
| 0.8118055555555556 | 0 |
| 0.8125 | 0 |
| 0.8131944444444444 | 0 |
| 0.813888888888889 | 0 |
| 0.8145833333333333 | 0 |
| 0.8152777777777778 | 0 |
| 0.8159722222222222 | 0 |
| 0.8166666666666668 | 0 |
| 0.8173611111111111 | 0 |
| 0.8180555555555555 | 0 |
| 0.81875 | 0 |
| 0.8194444444444445 | 0 |
| 0.8201388888888889 | 0 |
| 0.8208333333333333 | 0 |
| 0.8215277777777777 | 0 |
| 0.8222222222222223 | 0 |
| 0.8229166666666666 | 0 |
| 0.8236111111111111 | 0 |
| 0.8243055555555556 | 0 |
| 0.8250000000000001 | 0 |
| 0.8256944444444444 | 0 |
| 0.8263888888888888 | 0 |
| 0.8270833333333334 | 0 |
| 0.8277777777777778 | 0 |
| 0.8284722222222222 | 0 |
| 0.8291666666666666 | 0 |
| 0.8298611111111112 | 0 |
| 0.8305555555555556 | 0 |
| 0.8312499999999999 | 0 |
| 0.8319444444444444 | 0 |
| 0.8326388888888889 | 0 |
| 0.8333333333333334 | 0 |
| 0.8340277777777777 | 0 |
| 0.8347222222222223 | 0 |
| 0.8354166666666667 | 0 |
| 0.8361111111111111 | 0 |
| 0.8368055555555555 | 0 |
| 0.8375 | 0 |
| 0.8381944444444445 | 0 |
| 0.8388888888888889 | 0 |
| 0.8395833333333332 | 0 |
| 0.8402777777777778 | 0 |
| 0.8409722222222222 | 0 |
| 0.8416666666666667 | 0 |
| 0.842361111111111 | 0 |
| 0.8430555555555556 | 0 |
| 0.84375 | 0 |
| 0.8444444444444444 | 0 |
| 0.845138888888889 | 0 |
| 0.8458333333333333 | 0 |
| 0.8465277777777778 | 0 |
| 0.8472222222222222 | 0 |
| 0.8479166666666668 | 0 |
| 0.8486111111111111 | 0 |
| 0.8493055555555555 | 0 |
| 0.85 | 0 |
| 0.8506944444444445 | 0 |
| 0.8513888888888889 | 0 |
| 0.8520833333333333 | 0 |
| 0.8527777777777777 | 0 |
| 0.8534722222222223 | 0 |
| 0.8541666666666666 | 0 |
| 0.8548611111111111 | 0 |
| 0.8555555555555556 | 0 |
| 0.8562500000000001 | 0 |
| 0.8569444444444444 | 0 |
| 0.8576388888888888 | 0 |
| 0.8583333333333334 | 0 |
| 0.8590277777777778 | 0 |
| 0.8597222222222222 | 0 |
| 0.8604166666666666 | 0 |
| 0.8611111111111112 | 0 |
| 0.8618055555555556 | 0 |
| 0.8624999999999999 | 0 |
| 0.8631944444444444 | 0 |
| 0.8638888888888889 | 0 |
| 0.8645833333333334 | 0 |
| 0.8652777777777777 | 0 |
| 0.8659722222222223 | 0 |
| 0.8666666666666667 | 0 |
| 0.8673611111111111 | 0 |
| 0.8680555555555555 | 0 |
| 0.86875 | 0 |
| 0.8694444444444445 | 0 |
| 0.8701388888888889 | 0 |
| 0.8708333333333332 | 0 |
| 0.8715277777777778 | 0 |
| 0.8722222222222222 | 0 |
| 0.8729166666666667 | 0 |
| 0.873611111111111 | 0 |
| 0.8743055555555556 | 0 |
| 0.875 | 0 |
| 0.8756944444444444 | 0 |
| 0.876388888888889 | 0 |
| 0.8770833333333333 | 0 |
| 0.8777777777777778 | 0 |
| 0.8784722222222222 | 0 |
| 0.8791666666666668 | 0 |
| 0.8798611111111111 | 0 |
| 0.8805555555555555 | 0 |
| 0.88125 | 0 |
| 0.8819444444444445 | 0 |
| 0.8826388888888889 | 0 |
| 0.8833333333333333 | 0 |
| 0.8840277777777777 | 0 |
| 0.8847222222222223 | 0 |
| 0.8854166666666666 | 0 |
| 0.8861111111111111 | 0 |
| 0.8868055555555556 | 0 |
| 0.8875000000000001 | 0 |
| 0.8881944444444444 | 0 |
| 0.8888888888888888 | 0 |
| 0.8895833333333334 | 0 |
| 0.8902777777777778 | 0 |
| 0.8909722222222222 | 0 |
| 0.8916666666666666 | 0 |
| 0.8923611111111112 | 0 |
| 0.8930555555555556 | 0 |
| 0.8937499999999999 | 0 |
| 0.8944444444444444 | 0 |
| 0.8951388888888889 | 0 |
| 0.8958333333333334 | 0 |
| 0.8965277777777777 | 0 |
| 0.8972222222222223 | 0 |
| 0.8979166666666667 | 0 |
| 0.8986111111111111 | 0 |
| 0.8993055555555555 | 0 |
| 0.9 | 0 |
| 0.9006944444444445 | 0 |
| 0.9013888888888889 | 0 |
| 0.9020833333333332 | 0 |
| 0.9027777777777778 | 0 |
| 0.9034722222222222 | 0 |
| 0.9041666666666667 | 0 |
| 0.904861111111111 | 0 |
| 0.9055555555555556 | 0 |
| 0.90625 | 0 |
| 0.9069444444444444 | 0 |
| 0.907638888888889 | 0 |
| 0.9083333333333333 | 0 |
| 0.9090277777777778 | 0 |
| 0.9097222222222222 | 0 |
| 0.9104166666666668 | 0 |
| 0.9111111111111111 | 0 |
| 0.9118055555555555 | 0 |
| 0.9125 | 0 |
| 0.9131944444444445 | 0 |
| 0.9138888888888889 | 0 |
| 0.9145833333333333 | 0 |
| 0.9152777777777777 | 0 |
| 0.9159722222222223 | 0 |
| 0.9166666666666666 | 0 |
| 0.9173611111111111 | 0 |
| 0.9180555555555556 | 0 |
| 0.9187500000000001 | 0 |
| 0.9194444444444444 | 0 |
| 0.9201388888888888 | 0 |
| 0.9208333333333334 | 0 |
| 0.9215277777777778 | 0 |
| 0.9222222222222222 | 0 |
| 0.9229166666666666 | 0 |
| 0.9236111111111112 | 0 |
| 0.9243055555555556 | 0 |
| 0.9249999999999999 | 0 |
| 0.9256944444444444 | 0 |
| 0.9263888888888889 | 0 |
| 0.9270833333333334 | 0 |
| 0.9277777777777777 | 0 |
| 0.9284722222222223 | 0 |
| 0.9291666666666667 | 0 |
| 0.9298611111111111 | 0 |
| 0.9305555555555555 | 0 |
| 0.93125 | 0 |
| 0.9319444444444445 | 0 |
| 0.9326388888888889 | 0 |
| 0.9333333333333332 | 0 |
| 0.9340277777777778 | 0 |
| 0.9347222222222222 | 0 |
| 0.9354166666666667 | 0 |
| 0.936111111111111 | 0 |
| 0.9368055555555556 | 0 |
| 0.9375 | 0 |
| 0.9381944444444444 | 0 |
| 0.938888888888889 | 0 |
| 0.9395833333333333 | 0 |
| 0.9402777777777778 | 0 |
| 0.9409722222222222 | 0 |
| 0.9416666666666668 | 0 |
| 0.9423611111111111 | 0 |
| 0.9430555555555555 | 0 |
| 0.94375 | 0 |
| 0.9444444444444445 | 0 |
| 0.9451388888888889 | 0 |
| 0.9458333333333333 | 0 |
| 0.9465277777777777 | 0 |
| 0.9472222222222223 | 0 |
| 0.9479166666666666 | 0 |
| 0.9486111111111111 | 0 |
| 0.9493055555555556 | 0 |
| 0.9500000000000001 | 0 |
| 0.9506944444444444 | 0 |
| 0.9513888888888888 | 0 |
| 0.9520833333333334 | 0 |
| 0.9527777777777778 | 0 |
| 0.9534722222222222 | 0 |
| 0.9541666666666666 | 0 |
| 0.9548611111111112 | 0 |
| 0.9555555555555556 | 0 |
| 0.9562499999999999 | 0 |
| 0.9569444444444444 | 0 |
| 0.9576388888888889 | 0 |
| 0.9583333333333334 | 0 |
| 0.9590277777777777 | 0 |
| 0.9597222222222223 | 0 |
| 0.9604166666666667 | 0 |
| 0.9611111111111111 | 0 |
| 0.9618055555555555 | 0 |
| 0.9625 | 0 |
| 0.9631944444444445 | 0 |
| 0.9638888888888889 | 0 |
| 0.9645833333333332 | 0 |
| 0.9652777777777778 | 0 |
| 0.9659722222222222 | 0 |
| 0.9666666666666667 | 0 |
| 0.967361111111111 | 0 |
| 0.9680555555555556 | 0 |
| 0.96875 | 0 |
| 0.9694444444444444 | 0 |
| 0.970138888888889 | 0 |
| 0.9708333333333333 | 0 |
| 0.9715277777777778 | 0 |
| 0.9722222222222222 | 0 |
| 0.9729166666666668 | 0 |
| 0.9736111111111111 | 0 |
| 0.9743055555555555 | 0 |
| 0.975 | 0 |
| 0.9756944444444445 | 0 |
| 0.9763888888888889 | 0 |
| 0.9770833333333333 | 0 |
| 0.9777777777777777 | 0 |
| 0.9784722222222223 | 0 |
| 0.9791666666666666 | 0 |
| 0.9798611111111111 | 0 |
| 0.9805555555555556 | 0 |
| 0.9812500000000001 | 0 |
| 0.9819444444444444 | 0 |
| 0.9826388888888888 | 0 |
| 0.9833333333333334 | 0 |
| 0.9840277777777778 | 0 |
| 0.9847222222222222 | 0 |
| 0.9854166666666666 | 0 |
| 0.9861111111111112 | 0 |
| 0.9868055555555556 | 0 |
| 0.9874999999999999 | 0 |
| 0.9881944444444444 | 0 |
| 0.9888888888888889 | 0 |
| 0.9895833333333334 | 0 |
| 0.9902777777777777 | 0 |
| 0.9909722222222223 | 0 |
| 0.9916666666666667 | 0 |
| 0.9923611111111111 | 0 |
| 0.9930555555555555 | 0 |
| 0.99375 | 0 |
| 0.9944444444444445 | 0 |
| 0.9951388888888889 | 0 |
| 0.9958333333333332 | 0 |
| 0.9965277777777778 | 0 |
| 0.9972222222222222 | 0 |
| 0.9979166666666667 | 0 |
| 0.998611111111111 | 0 |
| 0.9993055555555556 | 0 |